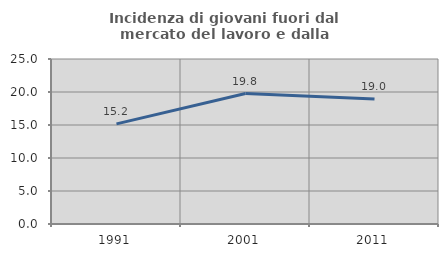
| Category | Incidenza di giovani fuori dal mercato del lavoro e dalla formazione  |
|---|---|
| 1991.0 | 15.173 |
| 2001.0 | 19.761 |
| 2011.0 | 18.957 |